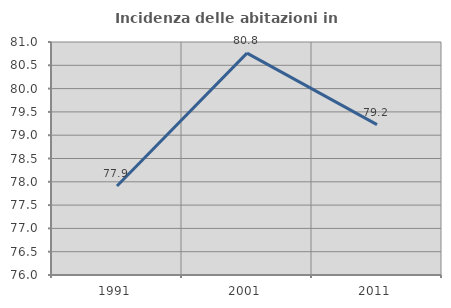
| Category | Incidenza delle abitazioni in proprietà  |
|---|---|
| 1991.0 | 77.91 |
| 2001.0 | 80.761 |
| 2011.0 | 79.226 |